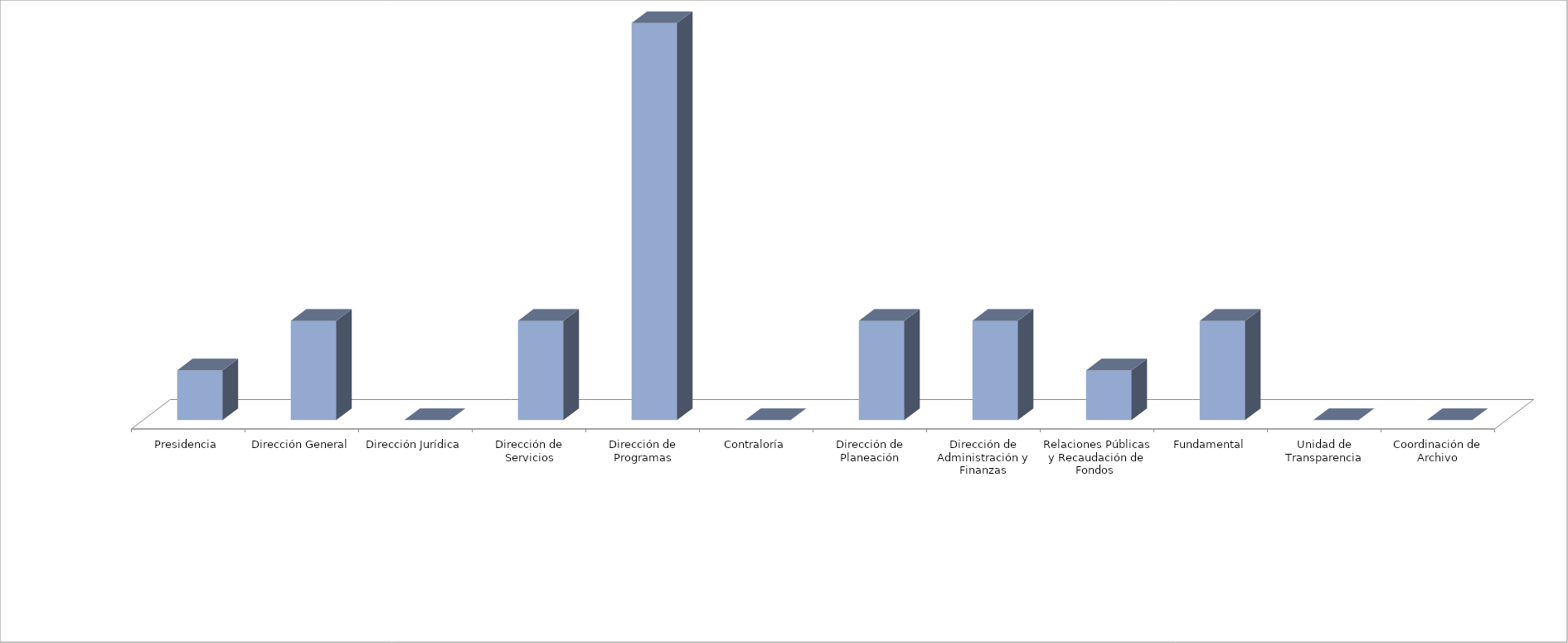
| Category | Series 0 | Series 1 |
|---|---|---|
| Presidencia |  | 1 |
| Dirección General |  | 2 |
| Dirección Jurídica |  | 0 |
| Dirección de Servicios |  | 2 |
| Dirección de Programas |  | 8 |
| Contraloría |  | 0 |
| Dirección de Planeación |  | 2 |
| Dirección de Administración y Finanzas |  | 2 |
| Relaciones Públicas y Recaudación de Fondos  |  | 1 |
| Fundamental |  | 2 |
| Unidad de Transparencia |  | 0 |
| Coordinación de Archivo |  | 0 |